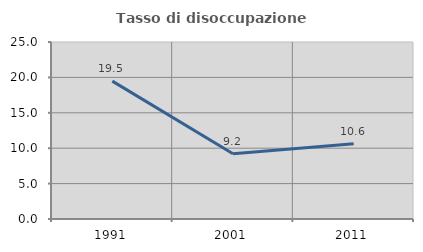
| Category | Tasso di disoccupazione giovanile  |
|---|---|
| 1991.0 | 19.469 |
| 2001.0 | 9.211 |
| 2011.0 | 10.638 |